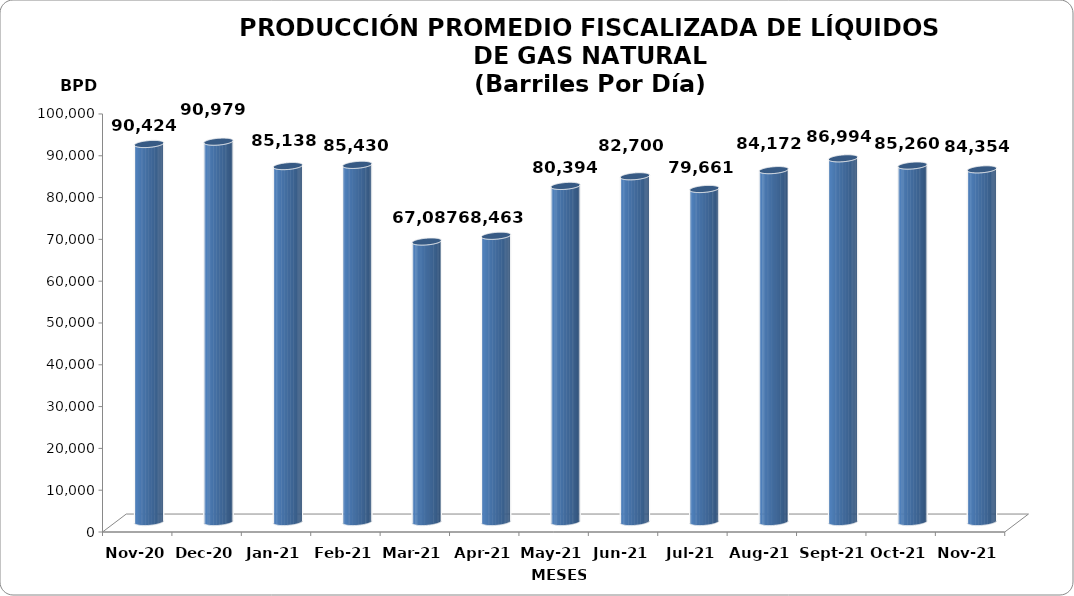
| Category | Series 0 |
|---|---|
| 2020-11-01 | 90424 |
| 2020-12-01 | 90979 |
| 2021-01-01 | 85138 |
| 2021-02-01 | 85430 |
| 2021-03-01 | 67087 |
| 2021-04-01 | 68463 |
| 2021-05-01 | 80393.645 |
| 2021-06-01 | 82699.833 |
| 2021-07-01 | 79661.29 |
| 2021-08-01 | 84171.548 |
| 2021-09-01 | 86994 |
| 2021-10-01 | 85260 |
| 2021-11-01 | 84354 |